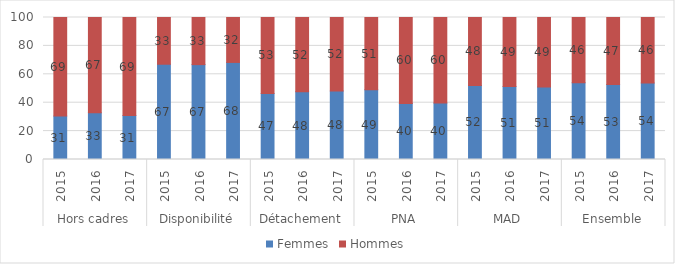
| Category | Femmes | Hommes |
|---|---|---|
| 0 | 30.563 | 69.437 |
| 1 | 32.864 | 67.136 |
| 2 | 30.986 | 69.014 |
| 3 | 67.091 | 32.909 |
| 4 | 66.819 | 33.181 |
| 5 | 68.368 | 31.632 |
| 6 | 46.565 | 53.435 |
| 7 | 47.787 | 52.213 |
| 8 | 48.241 | 51.759 |
| 9 | 49.153 | 50.847 |
| 10 | 39.508 | 60.492 |
| 11 | 39.754 | 60.246 |
| 12 | 52.189 | 47.811 |
| 13 | 51.485 | 48.515 |
| 14 | 51.026 | 48.974 |
| 15 | 54.001 | 45.999 |
| 16 | 52.85 | 47.15 |
| 17 | 53.877 | 46.123 |